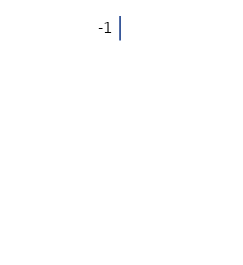
| Category | Series 0 |
|---|---|
| 0 | -1 |
| 1 | 0 |
| 2 | 0 |
| 3 | 0 |
| 4 | 0 |